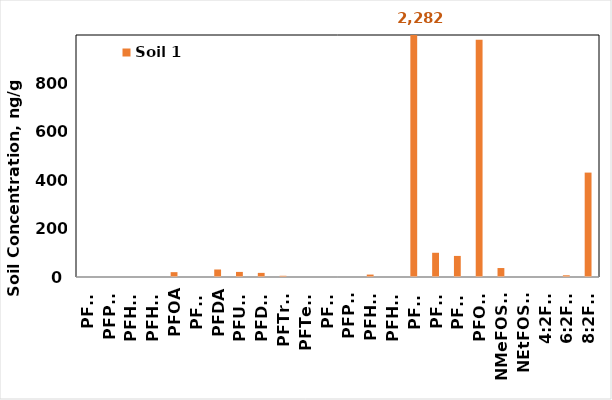
| Category | Soil 1 |
|---|---|
| PFBA | 0 |
| PFPeA | 0 |
| PFHxA | 0 |
| PFHpA | 0 |
| PFOA | 20 |
| PFNA | 0 |
| PFDA | 31 |
| PFUnA | 21 |
| PFDoA | 17 |
| PFTrDA | 5 |
| PFTeDA | 0 |
| PFBS | 0 |
| PFPeS | 0 |
| PFHxS | 10 |
| PFHpS | 0 |
| PFOS | 2282 |
| PFNS | 100 |
| PFDS | 87 |
| PFOSA | 979 |
| NMeFOSAA | 37 |
| NEtFOSAA | 0 |
| 4:2FTS | 0 |
| 6:2FTS | 7 |
| 8:2FTS | 431 |